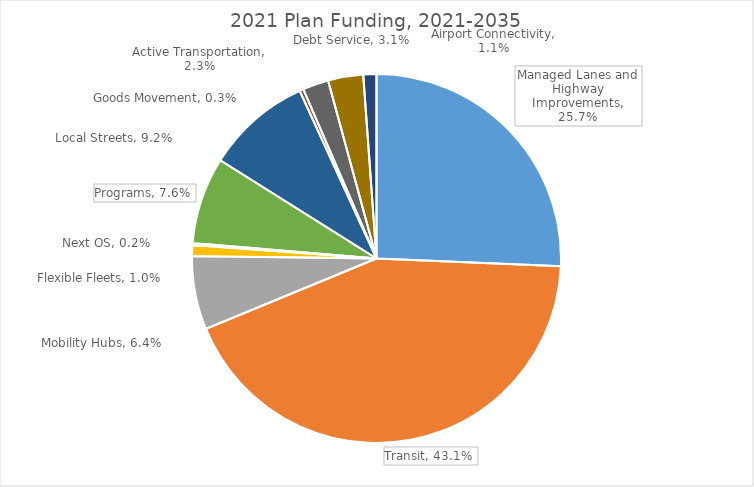
| Category | Series 0 |
|---|---|
| Managed Lanes and Highway Improvements | 0.257 |
| Transit | 0.431 |
| Mobility Hubs | 0.064 |
| Flexible Fleets | 0.01 |
| Next OS | 0.002 |
| Programs | 0.076 |
| Local Streets | 0.092 |
| Goods Movement | 0.003 |
| Active Transportation | 0.023 |
| Debt Service | 0.031 |
| Airport Connectivity | 0.011 |